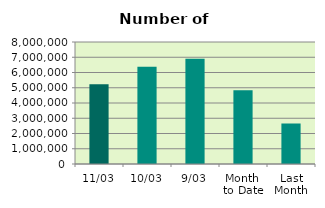
| Category | Series 0 |
|---|---|
| 11/03 | 5231022 |
| 10/03 | 6380334 |
| 9/03 | 6908644 |
| Month 
to Date | 4833548.5 |
| Last
Month | 2656039 |